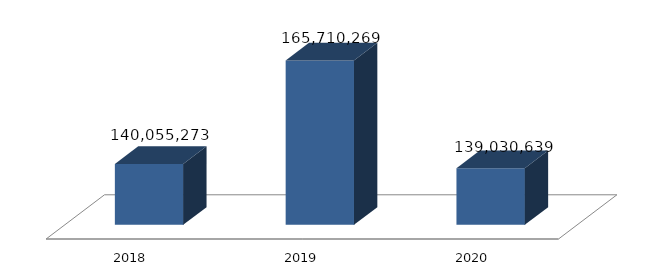
| Category | Dukungan Manajemen Dan Pelaksanaan Tugas Teknis Lainnya LPP RRI |
|---|---|
| 2018.0 | 140055273 |
| 2019.0 | 165710269 |
| 2020.0 | 139030639 |